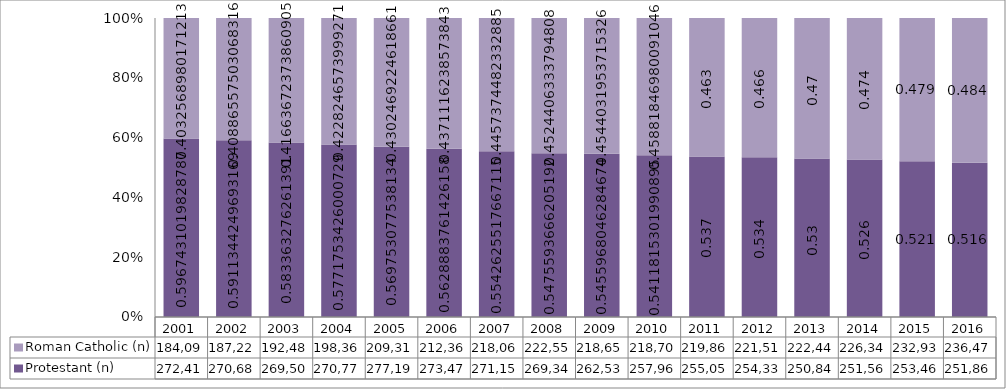
| Category | Protestant (n) | Roman Catholic (n) |
|---|---|---|
| 2001.0 | 272418 | 184090 |
| 2002.0 | 270684 | 187222 |
| 2003.0 | 269508 | 192482 |
| 2004.0 | 270772 | 198361 |
| 2005.0 | 277190 | 209319 |
| 2006.0 | 273472 | 212365 |
| 2007.0 | 271153 | 218061 |
| 2008.0 | 269345 | 222556 |
| 2009.0 | 262539 | 218657 |
| 2010.0 | 257965 | 218705 |
| 2011.0 | 255056 | 219867 |
| 2012.0 | 254337 | 221511 |
| 2013.0 | 250843 | 222440 |
| 2014.0 | 251563 | 226348 |
| 2015.0 | 253465 | 232935 |
| 2016.0 | 251869 | 236478 |